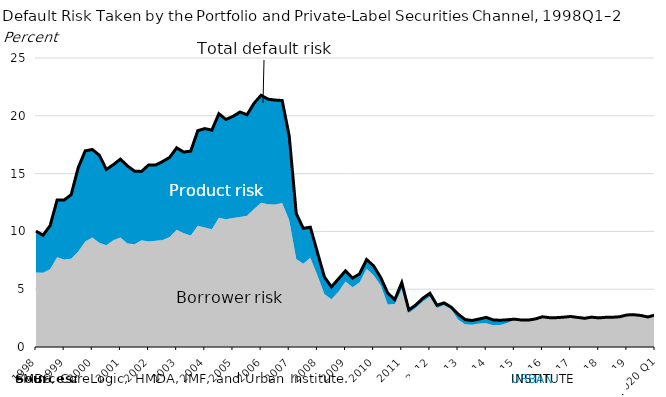
| Category | Series 2 |
|---|---|
| 1998 | 10.024 |
| 1998 | 9.668 |
| 1998 | 10.491 |
| 1998 | 12.708 |
| 1999 | 12.709 |
| 1999 | 13.179 |
| 1999 | 15.512 |
| 1999 | 16.97 |
| 2000 | 17.087 |
| 2000 | 16.594 |
| 2000 | 15.357 |
| 2000 | 15.779 |
| 2001 | 16.253 |
| 2001 | 15.664 |
| 2001 | 15.213 |
| 2001 | 15.188 |
| 2002 | 15.739 |
| 2002 | 15.743 |
| 2002 | 16.048 |
| 2002 | 16.404 |
| 2003 | 17.231 |
| 2003 | 16.863 |
| 2003 | 16.945 |
| 2003 | 18.715 |
| 2004 | 18.895 |
| 2004 | 18.759 |
| 2004 | 20.181 |
| 2004 | 19.687 |
| 2005 | 19.95 |
| 2005 | 20.327 |
| 2005 | 20.09 |
| 2005 | 21.088 |
| 2006 | 21.774 |
| 2006 | 21.437 |
| 2006 | 21.362 |
| 2006 | 21.321 |
| 2007 | 18.249 |
| 2007 | 11.542 |
| 2007 | 10.264 |
| 2007 | 10.363 |
| 2008 | 8.207 |
| 2008 | 6.064 |
| 2008 | 5.199 |
| 2008 | 5.897 |
| 2009 | 6.591 |
| 2009 | 5.958 |
| 2009 | 6.325 |
| 2009 | 7.568 |
| 2010 | 7.014 |
| 2010 | 6.017 |
| 2010 | 4.672 |
| 2010 | 4.096 |
| 2011 | 5.567 |
| 2011 | 3.208 |
| 2011 | 3.64 |
| 2011 | 4.221 |
| 2012 | 4.65 |
| 2012 | 3.613 |
| 2012 | 3.82 |
| 2012 | 3.459 |
| 2013 | 2.854 |
| 2013 | 2.375 |
| 2013 | 2.293 |
| 2013 | 2.422 |
| 2014 | 2.564 |
| 2014 | 2.342 |
| 2014 | 2.314 |
| 2014 | 2.357 |
| 2015 | 2.409 |
| 2015 | 2.335 |
| 2015 | 2.328 |
| 2015 | 2.432 |
| 2016 | 2.614 |
| 2016 | 2.535 |
| 2016 | 2.54 |
| 2016 | 2.578 |
| 2017 | 2.642 |
| 2017 | 2.558 |
| 2017 | 2.485 |
| 2017 | 2.584 |
| 2018 | 2.518 |
| 2018 | 2.568 |
| 2018 | 2.574 |
| 2018 | 2.618 |
| 2019 | 2.774 |
| 2019 | 2.791 |
| 2019 | 2.725 |
| 2019 | 2.597 |
| 2020 Q1 | 2.77 |